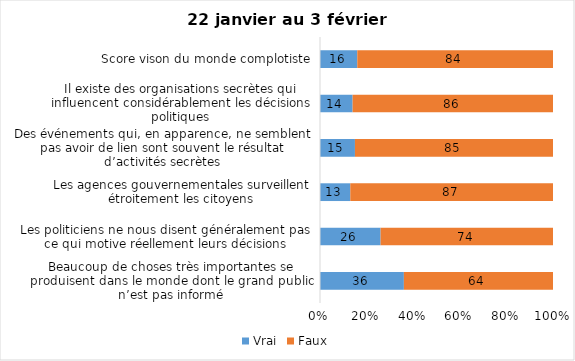
| Category | Vrai | Faux |
|---|---|---|
| Beaucoup de choses très importantes se produisent dans le monde dont le grand public n’est pas informé | 36 | 64 |
| Les politiciens ne nous disent généralement pas ce qui motive réellement leurs décisions | 26 | 74 |
| Les agences gouvernementales surveillent étroitement les citoyens | 13 | 87 |
| Des événements qui, en apparence, ne semblent pas avoir de lien sont souvent le résultat d’activités secrètes | 15 | 85 |
| Il existe des organisations secrètes qui influencent considérablement les décisions politiques | 14 | 86 |
| Score vison du monde complotiste | 16 | 84 |